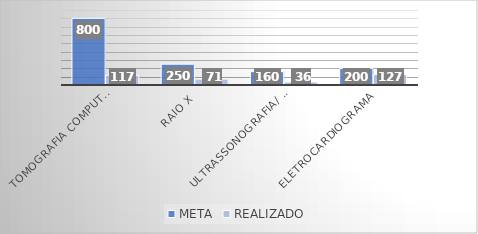
| Category | META | REALIZADO |
|---|---|---|
| Tomografia computadorizada | 800 | 117 |
| Raio x | 250 | 71 |
| Ultrassonografia/ Doppler  | 160 | 36 |
| Eletrocardiograma | 200 | 127 |